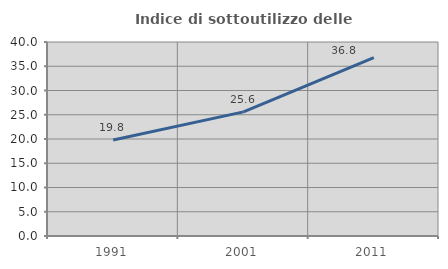
| Category | Indice di sottoutilizzo delle abitazioni  |
|---|---|
| 1991.0 | 19.778 |
| 2001.0 | 25.599 |
| 2011.0 | 36.796 |